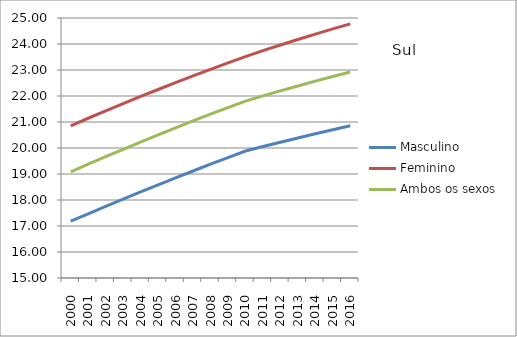
| Category | Masculino | Feminino | Ambos os sexos |
|---|---|---|---|
| 2000.0 | 17.184 | 20.854 | 19.081 |
| 2001.0 | 17.469 | 21.144 | 19.375 |
| 2002.0 | 17.752 | 21.428 | 19.665 |
| 2003.0 | 18.033 | 21.707 | 19.95 |
| 2004.0 | 18.31 | 21.981 | 20.23 |
| 2005.0 | 18.583 | 22.25 | 20.506 |
| 2006.0 | 18.852 | 22.514 | 20.776 |
| 2007.0 | 19.116 | 22.773 | 21.041 |
| 2008.0 | 19.377 | 23.026 | 21.301 |
| 2009.0 | 19.633 | 23.275 | 21.556 |
| 2010.0 | 19.884 | 23.517 | 21.805 |
| 2011.0 | 20.056 | 23.743 | 22.005 |
| 2012.0 | 20.224 | 23.96 | 22.198 |
| 2013.0 | 20.387 | 24.173 | 22.386 |
| 2014.0 | 20.548 | 24.38 | 22.57 |
| 2015.0 | 20.704 | 24.58 | 22.749 |
| 2016.0 | 20.856 | 24.776 | 22.923 |